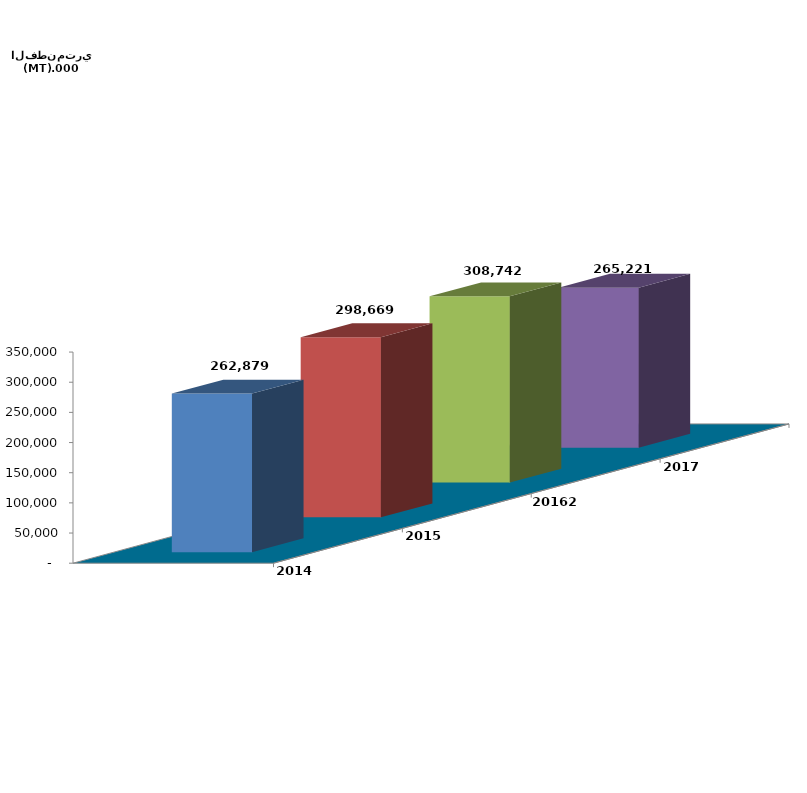
| Category | 2014 | 2015 | 20162 | 2017 |
|---|---|---|---|---|
| 0 | 262879 | 298669 | 308741.808 | 265220.521 |